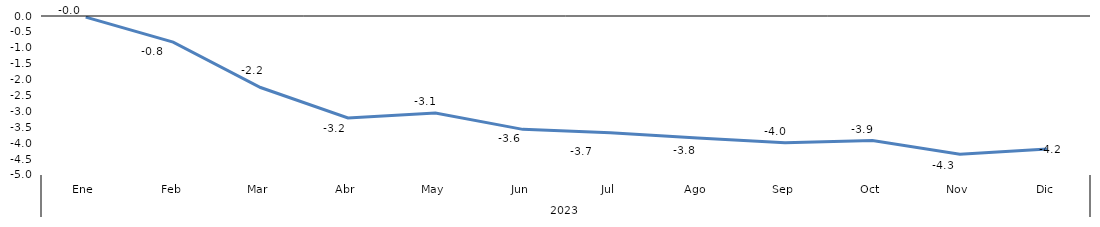
| Category | Bogotá |
|---|---|
| 0 | -0.036 |
| 1 | -0.821 |
| 2 | -2.248 |
| 3 | -3.206 |
| 4 | -3.05 |
| 5 | -3.565 |
| 6 | -3.673 |
| 7 | -3.838 |
| 8 | -3.985 |
| 9 | -3.913 |
| 10 | -4.346 |
| 11 | -4.181 |